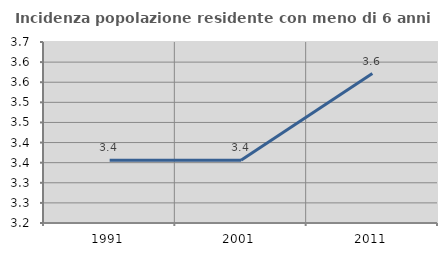
| Category | Incidenza popolazione residente con meno di 6 anni |
|---|---|
| 1991.0 | 3.356 |
| 2001.0 | 3.356 |
| 2011.0 | 3.571 |